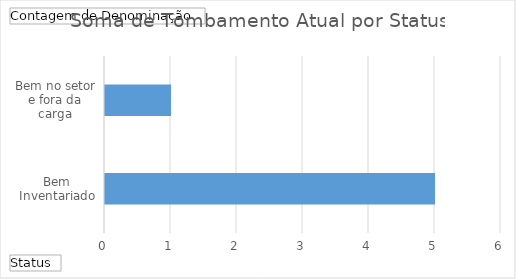
| Category | Total |
|---|---|
| Bem Inventariado | 5 |
| Bem no setor e fora da carga | 1 |